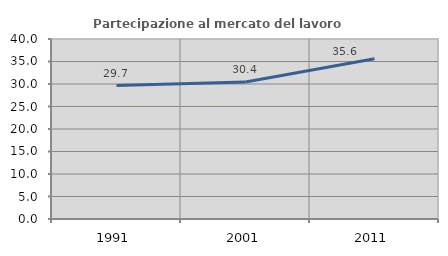
| Category | Partecipazione al mercato del lavoro  femminile |
|---|---|
| 1991.0 | 29.659 |
| 2001.0 | 30.426 |
| 2011.0 | 35.601 |